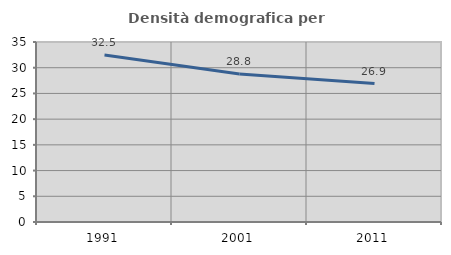
| Category | Densità demografica |
|---|---|
| 1991.0 | 32.462 |
| 2001.0 | 28.787 |
| 2011.0 | 26.93 |